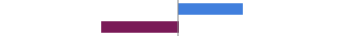
| Category | Series 0 |
|---|---|
| Favorable | 0.361 |
| Unfavorable | -0.434 |